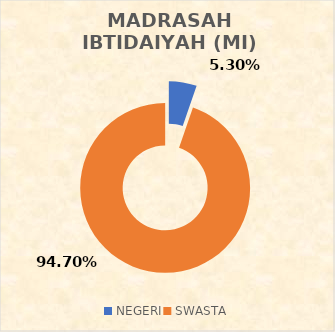
| Category | MADRASAH IBTIDAIYAH (MI) STATUS SEKOLAH |
|---|---|
| NEGERI | 7 |
| SWASTA | 125 |